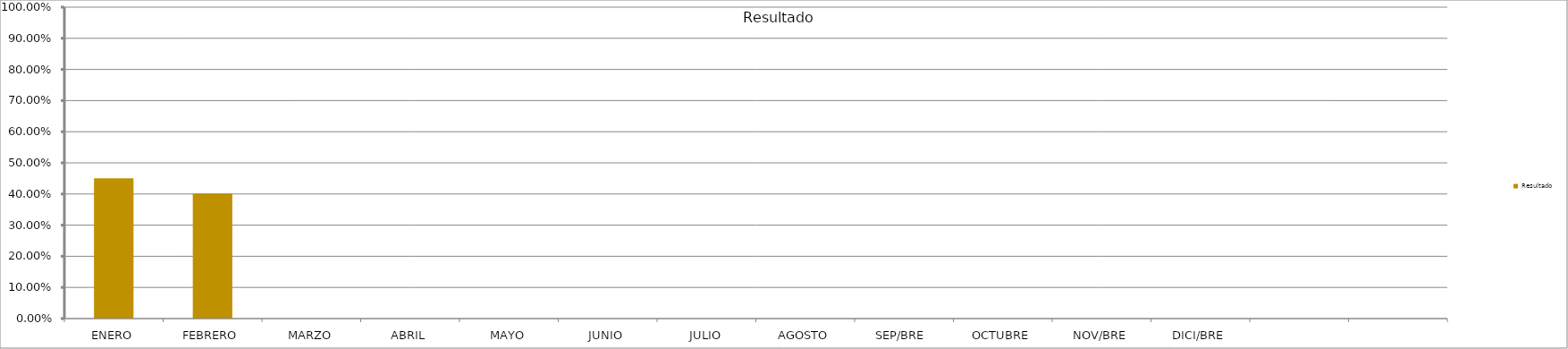
| Category | Resultado  |
|---|---|
| ENERO | 0.45 |
| FEBRERO | 0.401 |
| MARZO | 0 |
| ABRIL | 0 |
| MAYO | 0 |
| JUNIO | 0 |
| JULIO | 0 |
| AGOSTO | 0 |
| SEP/BRE  | 0 |
| OCTUBRE | 0 |
| NOV/BRE | 0 |
| DICI/BRE | 0 |